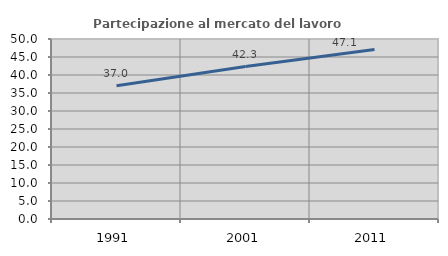
| Category | Partecipazione al mercato del lavoro  femminile |
|---|---|
| 1991.0 | 37.032 |
| 2001.0 | 42.35 |
| 2011.0 | 47.071 |